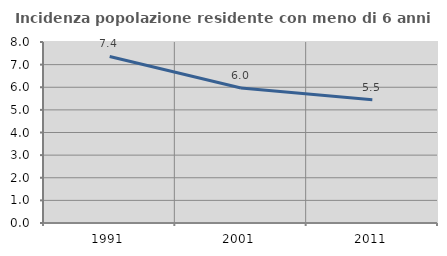
| Category | Incidenza popolazione residente con meno di 6 anni |
|---|---|
| 1991.0 | 7.363 |
| 2001.0 | 5.968 |
| 2011.0 | 5.45 |